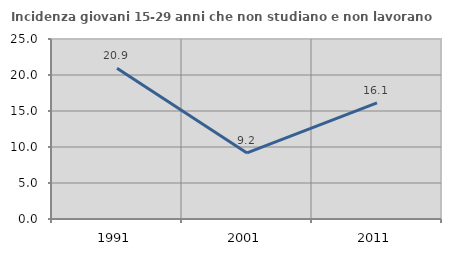
| Category | Incidenza giovani 15-29 anni che non studiano e non lavorano  |
|---|---|
| 1991.0 | 20.928 |
| 2001.0 | 9.18 |
| 2011.0 | 16.129 |